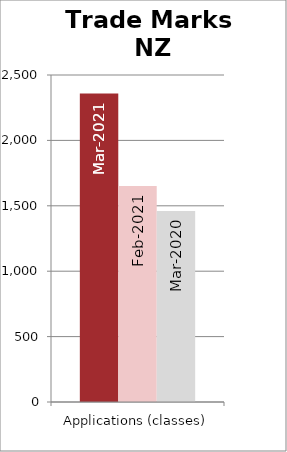
| Category | Mar-2021 | Feb-2021 | Mar-2020 |
|---|---|---|---|
| Applications (classes) | 2358 | 1651 | 1460 |